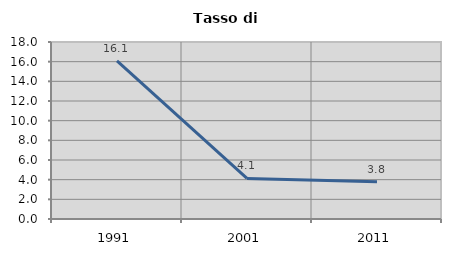
| Category | Tasso di disoccupazione   |
|---|---|
| 1991.0 | 16.088 |
| 2001.0 | 4.131 |
| 2011.0 | 3.791 |